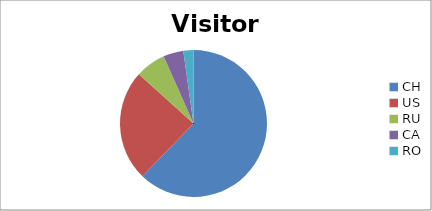
| Category | Visitors |
|---|---|
| CH | 28 |
| US | 11 |
| RU | 3 |
| CA | 2 |
| RO | 1 |